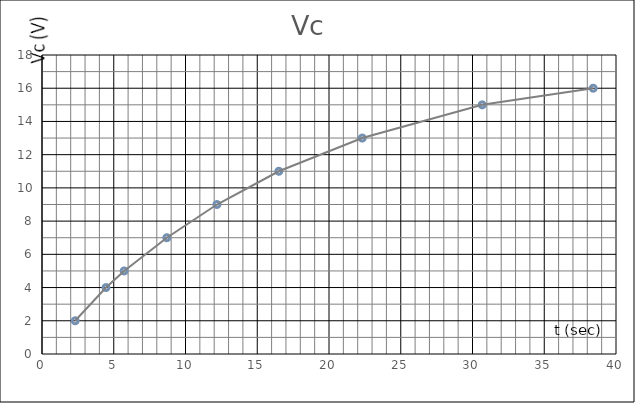
| Category | Vc (V) |
|---|---|
| 2.31 | 2 |
| 4.46 | 4 |
| 5.725 | 5 |
| 8.7 | 7 |
| 12.19 | 9 |
| 16.505000000000003 | 11 |
| 22.315 | 13 |
| 30.675 | 15 |
| 38.41 | 16 |